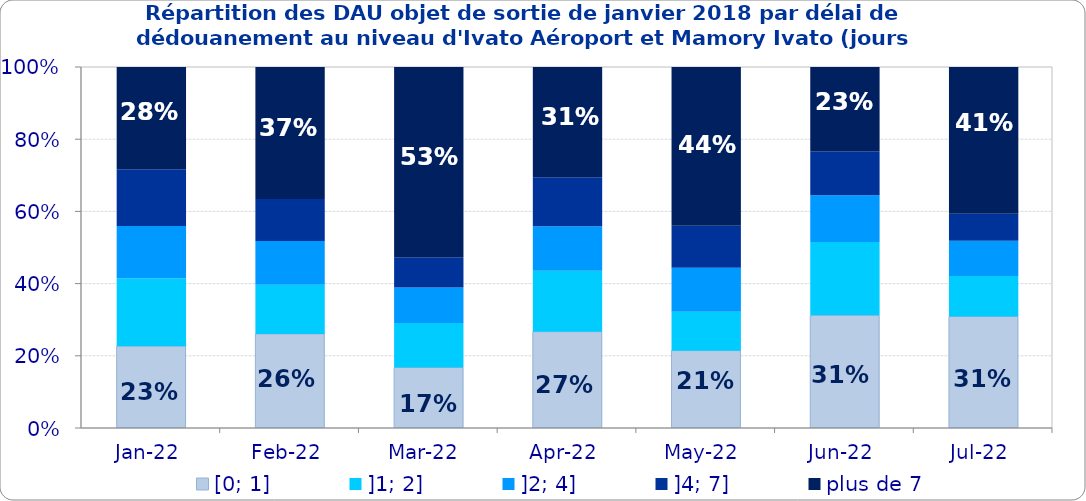
| Category | [0; 1] | ]1; 2] | ]2; 4] | ]4; 7] | plus de 7 |
|---|---|---|---|---|---|
| 2022-01-01 | 0.227 | 0.188 | 0.145 | 0.158 | 0.283 |
| 2022-02-01 | 0.261 | 0.136 | 0.121 | 0.116 | 0.366 |
| 2022-03-01 | 0.168 | 0.123 | 0.098 | 0.083 | 0.527 |
| 2022-04-01 | 0.267 | 0.169 | 0.123 | 0.136 | 0.305 |
| 2022-05-01 | 0.214 | 0.108 | 0.122 | 0.116 | 0.44 |
| 2022-06-01 | 0.312 | 0.203 | 0.129 | 0.122 | 0.233 |
| 2022-07-01 | 0.309 | 0.112 | 0.098 | 0.074 | 0.407 |